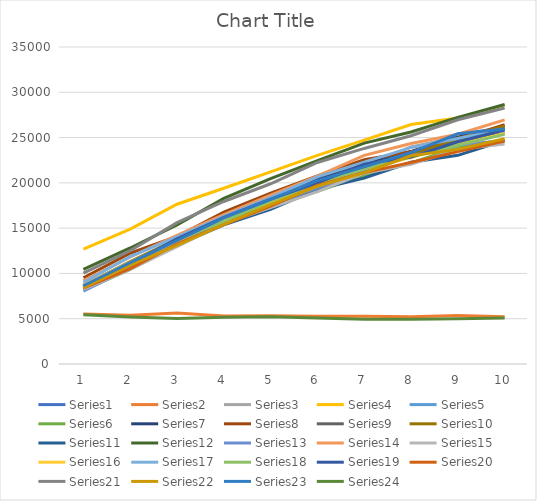
| Category | Series 0 | Series 1 | Series 2 | Series 3 | Series 4 | Series 5 | Series 6 | Series 7 | Series 8 | Series 9 | Series 10 | Series 11 | Series 12 | Series 13 | Series 14 | Series 15 | Series 16 | Series 17 | Series 18 | Series 19 | Series 20 | Series 21 | Series 22 | Series 23 |
|---|---|---|---|---|---|---|---|---|---|---|---|---|---|---|---|---|---|---|---|---|---|---|---|---|
| 0 | 8612 | 5525 | 8513 | 12691 | 8761 | 8165 | 8747 | 9521 | 8455 | 8655 | 8481 | 10454 | 8048 | 9194 | 8253 | 8747 | 9031 | 8581 | 8578 | 8388 | 10035 | 8426 | 8640 | 5426 |
| 1 | 10772 | 5383 | 10768 | 14896 | 11222 | 10449 | 11164 | 12232 | 10886 | 11296 | 10681 | 12809 | 10619 | 11814 | 10435 | 11234 | 11846 | 10958 | 11030 | 10531 | 12503 | 10923 | 11191 | 5197 |
| 2 | 13607 | 5629 | 13762 | 17642 | 13554 | 13236 | 13763 | 14076 | 13471 | 13774 | 13118 | 15361 | 13306 | 14190 | 12955 | 13536 | 14038 | 13716 | 13817 | 13249 | 15602 | 13095 | 13633 | 5018 |
| 3 | 16314 | 5306 | 16128 | 19406 | 16228 | 15516 | 16626 | 16760 | 15694 | 16389 | 15365 | 18277 | 15656 | 16497 | 15512 | 15988 | 16306 | 15760 | 16176 | 15390 | 17941 | 15403 | 16130 | 5164 |
| 4 | 18437 | 5317 | 18043 | 21215 | 18300 | 17411 | 18648 | 18858 | 17967 | 18310 | 17069 | 20478 | 17643 | 18648 | 17271 | 17843 | 18388 | 17976 | 18195 | 17421 | 19902 | 17588 | 18165 | 5226 |
| 5 | 20008 | 5280 | 20020 | 23027 | 19848 | 19078 | 20483 | 20775 | 19955 | 20070 | 19277 | 22453 | 19425 | 20734 | 19025 | 19909 | 20661 | 19953 | 20013 | 19725 | 22248 | 19623 | 20250 | 5075 |
| 6 | 21959 | 5259 | 21956 | 24716 | 21888 | 20826 | 22189 | 22543 | 21363 | 21983 | 20540 | 24384 | 21268 | 23034 | 21063 | 21583 | 22293 | 21575 | 22069 | 21131 | 23801 | 21126 | 21764 | 4948 |
| 7 | 23429 | 5227 | 23970 | 26435 | 23408 | 22207 | 23454 | 23434 | 23101 | 22998 | 22275 | 25614 | 22967 | 24343 | 22040 | 22803 | 23891 | 22891 | 22843 | 22241 | 25197 | 22994 | 23347 | 4942 |
| 8 | 25310 | 5353 | 25035 | 27149 | 25287 | 23898 | 25197 | 24785 | 24558 | 24905 | 23038 | 27231 | 24185 | 25373 | 23709 | 24246 | 24893 | 24155 | 24541 | 23449 | 26968 | 23695 | 25422 | 5004 |
| 9 | 26107 | 5210 | 26197 | 28585 | 25823 | 24634 | 26046 | 26427 | 25464 | 26250 | 24682 | 28647 | 24678 | 26947 | 24302 | 25455 | 25934 | 25350 | 25832 | 24614 | 28264 | 24864 | 25939 | 5086 |